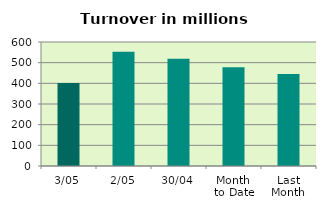
| Category | Series 0 |
|---|---|
| 3/05 | 401.764 |
| 2/05 | 553.198 |
| 30/04 | 518.68 |
| Month 
to Date | 477.481 |
| Last
Month | 444.663 |